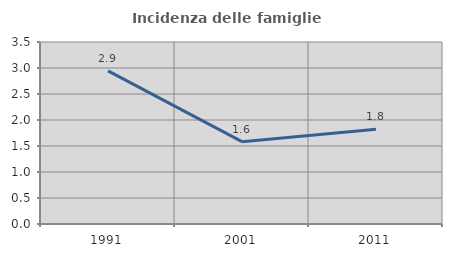
| Category | Incidenza delle famiglie numerose |
|---|---|
| 1991.0 | 2.946 |
| 2001.0 | 1.583 |
| 2011.0 | 1.82 |